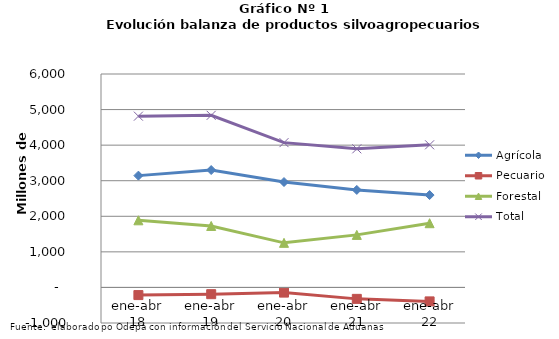
| Category | Agrícola | Pecuario | Forestal | Total |
|---|---|---|---|---|
| ene-abr 18 | 3142960 | -215195 | 1887085 | 4814850 |
| ene-abr 19 | 3300113 | -189652 | 1727868 | 4838329 |
| ene-abr 20 | 2962565 | -145324 | 1253477 | 4070718 |
| ene-abr 21 | 2740992 | -321684 | 1477242 | 3896550 |
| ene-abr 22 | 2597060 | -392936 | 1805230 | 4009354 |